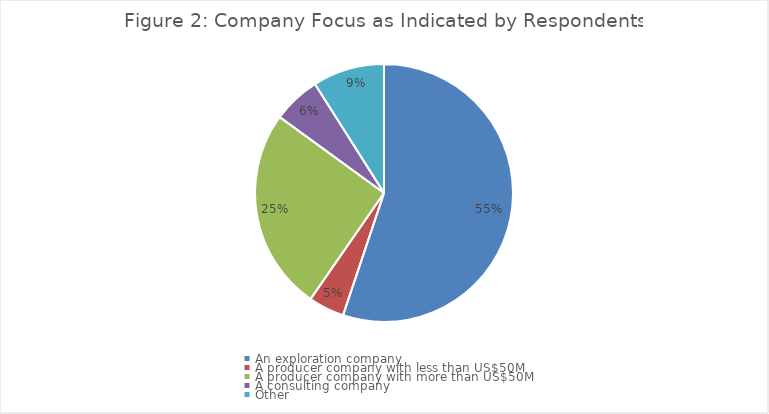
| Category | Series 0 |
|---|---|
| An exploration company | 0.552 |
| A producer company with less than US$50M | 0.045 |
| A producer company with more than US$50M | 0.254 |
| A consulting company | 0.06 |
| Other  | 0.09 |